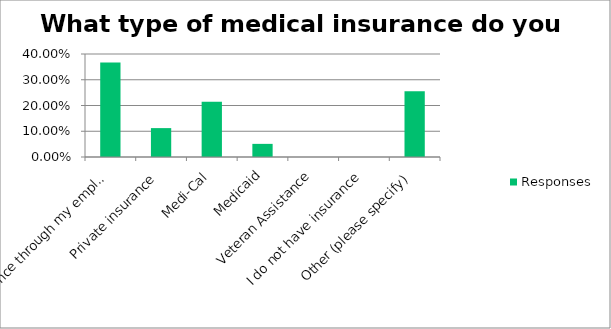
| Category | Responses |
|---|---|
| Insurance through my employer | 0.367 |
| Private insurance | 0.112 |
| Medi-Cal | 0.214 |
| Medicaid | 0.051 |
| Veteran Assistance | 0 |
| I do not have insurance | 0 |
| Other (please specify) | 0.255 |